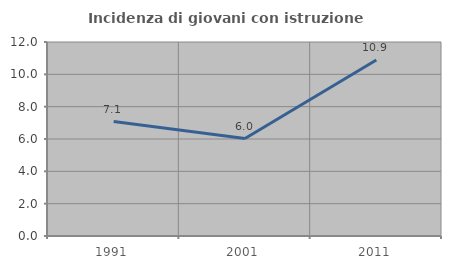
| Category | Incidenza di giovani con istruzione universitaria |
|---|---|
| 1991.0 | 7.08 |
| 2001.0 | 6.028 |
| 2011.0 | 10.891 |